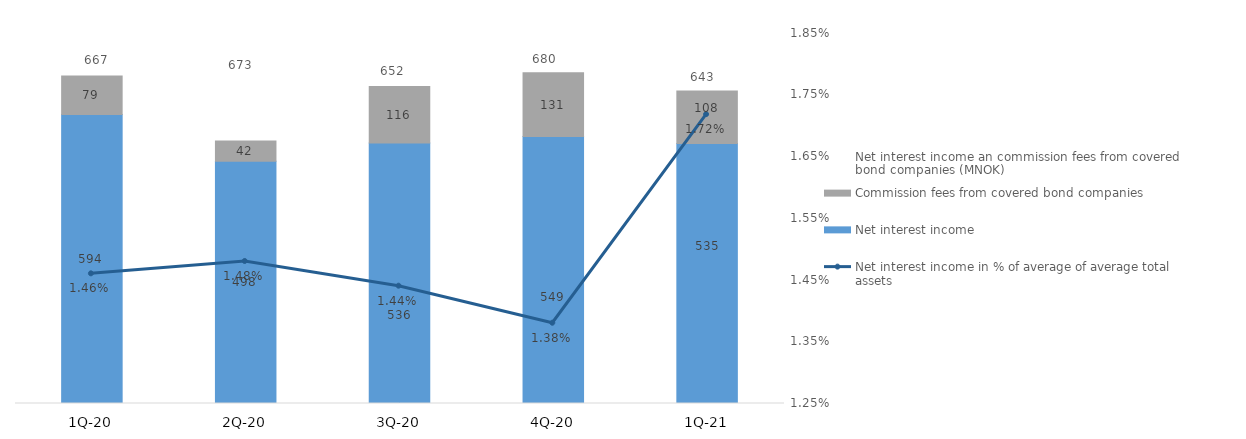
| Category | Net interest income | Commission fees from covered bond companies |
|---|---|---|
| 1Q-21 | 534.886 | 107.955 |
| 4Q-20 | 549.138 | 131.015 |
| 3Q-20 | 535.786 | 116.034 |
| 2Q-20 | 498.097 | 41.55 |
| 1Q-20 | 594.469 | 78.983 |